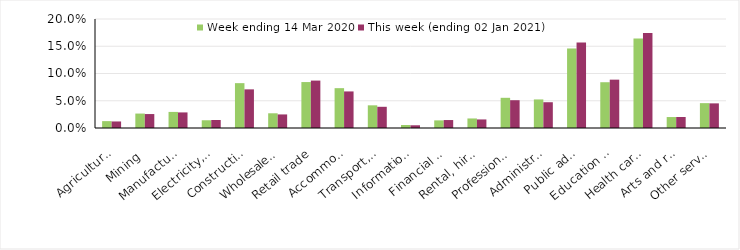
| Category | Week ending 14 Mar 2020 | This week (ending 02 Jan 2021) |
|---|---|---|
| Agriculture, forestry and fishing | 0.013 | 0.012 |
| Mining | 0.026 | 0.026 |
| Manufacturing | 0.03 | 0.029 |
| Electricity, gas, water and waste services | 0.014 | 0.015 |
| Construction | 0.082 | 0.071 |
| Wholesale trade | 0.027 | 0.025 |
| Retail trade | 0.084 | 0.087 |
| Accommodation and food services | 0.073 | 0.067 |
| Transport, postal and warehousing | 0.042 | 0.039 |
| Information media and telecommunications | 0.006 | 0.005 |
| Financial and insurance services | 0.014 | 0.015 |
| Rental, hiring and real estate services | 0.018 | 0.016 |
| Professional, scientific and technical services | 0.055 | 0.051 |
| Administrative and support services | 0.052 | 0.047 |
| Public administration and safety | 0.146 | 0.157 |
| Education and training | 0.084 | 0.089 |
| Health care and social assistance | 0.164 | 0.174 |
| Arts and recreation services | 0.02 | 0.02 |
| Other services | 0.046 | 0.045 |